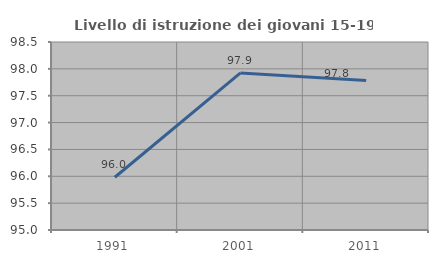
| Category | Livello di istruzione dei giovani 15-19 anni |
|---|---|
| 1991.0 | 95.982 |
| 2001.0 | 97.924 |
| 2011.0 | 97.783 |